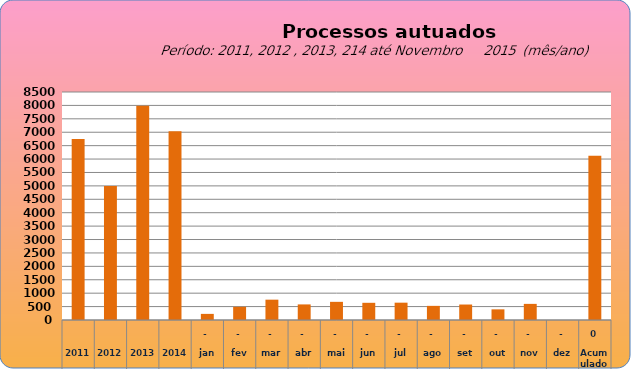
| Category | 6749 4997 7990 7034  228   486   758   581   676   641   646   527   577   397   601   -     6.118  |
|---|---|
| 2011 | 6749 |
| 2012 | 4997 |
| 2013 | 7990 |
| 2014 | 7034 |
| jan | 228 |
| fev | 492 |
| mar | 758 |
| abr | 581 |
| mai | 677 |
| jun | 641 |
| jul | 646 |
| ago | 527 |
| set | 577 |
| out | 397 |
| nov | 601 |
| dez | 0 |
| Acumulado
 | 6125 |